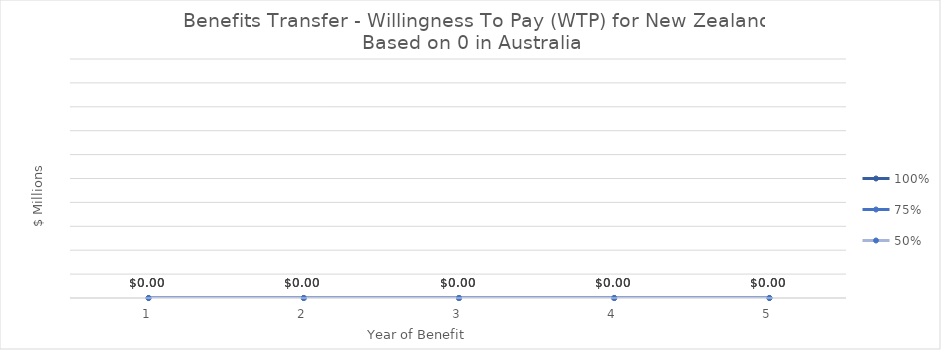
| Category | 100% | 75% | 50% |
|---|---|---|---|
| 1.0 | 0 | 0 | 0 |
| 2.0 | 0 | 0 | 0 |
| 3.0 | 0 | 0 | 0 |
| 4.0 | 0 | 0 | 0 |
| 5.0 | 0 | 0 | 0 |